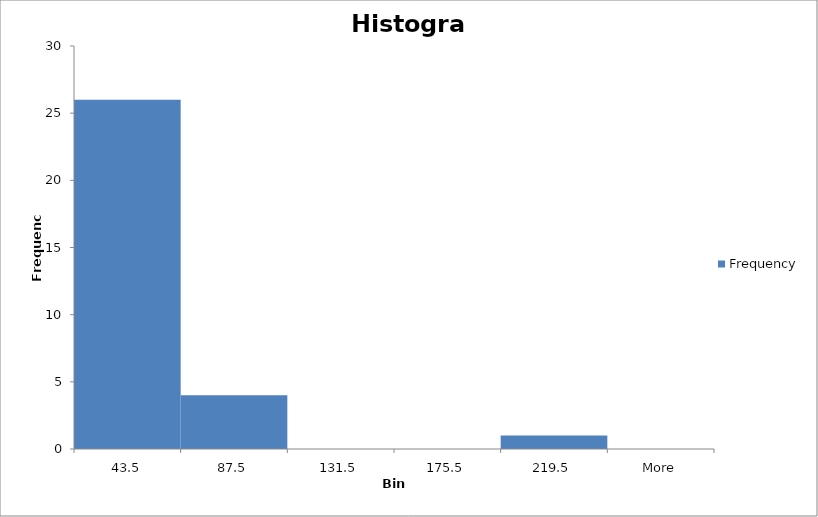
| Category | Frequency |
|---|---|
| 43.5 | 26 |
| 87.5 | 4 |
| 131.5 | 0 |
| 175.5 | 0 |
| 219.5 | 1 |
| More | 0 |